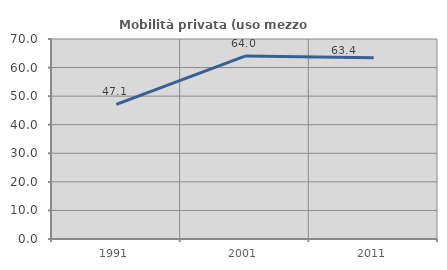
| Category | Mobilità privata (uso mezzo privato) |
|---|---|
| 1991.0 | 47.122 |
| 2001.0 | 64.017 |
| 2011.0 | 63.403 |